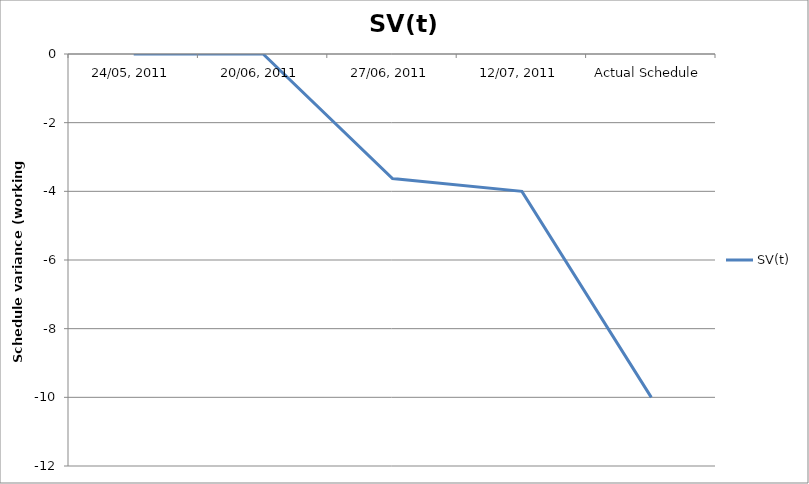
| Category | SV(t) |
|---|---|
| 24/05, 2011 | 0 |
| 20/06, 2011 | 0 |
| 27/06, 2011 | -3.625 |
| 12/07, 2011 | -4 |
| Actual Schedule | -10 |